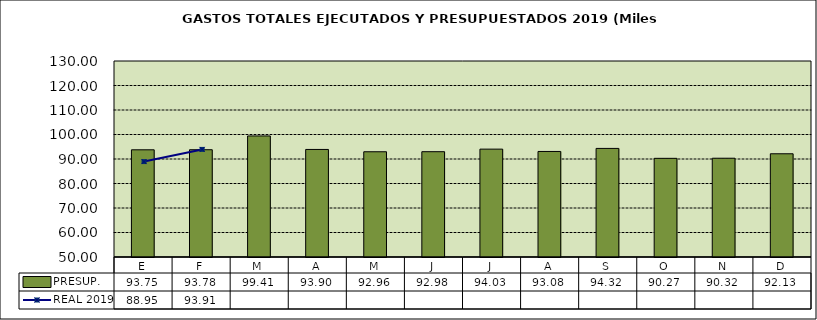
| Category | PRESUP. |
|---|---|
| E | 93.752 |
| F | 93.782 |
| M | 99.41 |
| A | 93.899 |
| M | 92.957 |
| J | 92.981 |
| J | 94.026 |
| A | 93.076 |
| S | 94.319 |
| O | 90.269 |
| N | 90.318 |
| D | 92.134 |